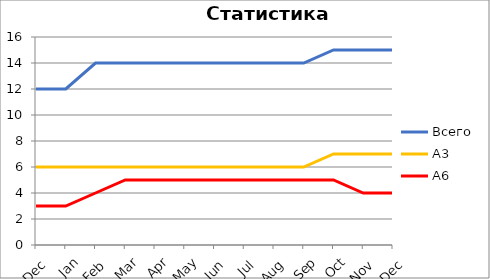
| Category | Всего | А3 | A6 |
|---|---|---|---|
| 0 | 12 | 6 | 3 |
| 1 | 12 | 6 | 3 |
| 2 | 14 | 6 | 4 |
| 3 | 14 | 6 | 5 |
| 4 | 14 | 6 | 5 |
| 5 | 14 | 6 | 5 |
| 6 | 14 | 6 | 5 |
| 7 | 14 | 6 | 5 |
| 8 | 14 | 6 | 5 |
| 9 | 14 | 6 | 5 |
| 10 | 15 | 7 | 5 |
| 11 | 15 | 7 | 4 |
| 12 | 15 | 7 | 4 |